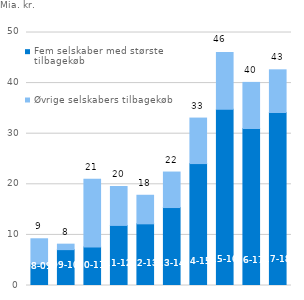
| Category | Fem selskaber med største tilbagekøb | Øvrige selskabers tilbagekøb |
|---|---|---|
| '08-09 | 4.231 | 5.003 |
| '09-10 | 7.089 | 1.082 |
| '10-11 | 7.62 | 13.372 |
| '11-12 | 11.874 | 7.689 |
| '12-13 | 12.188 | 5.646 |
| '13-14 | 15.409 | 7.015 |
| '14-15 | 24.095 | 8.995 |
| '15-16 | 34.846 | 11.182 |
| '16-17 | 31.026 | 9.113 |
| '17-18 | 34.187 | 8.436 |